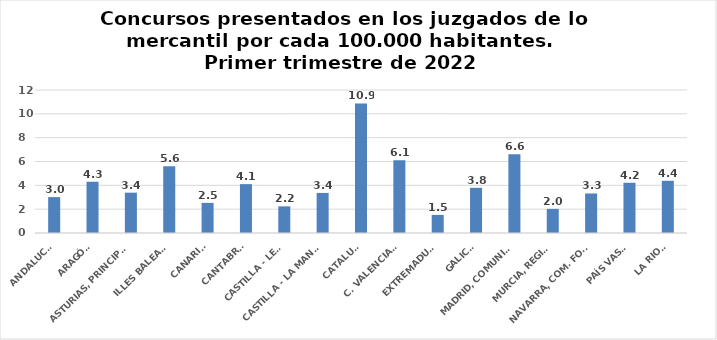
| Category | Series 0 |
|---|---|
| ANDALUCÍA | 3.013 |
| ARAGÓN | 4.301 |
| ASTURIAS, PRINCIPADO | 3.385 |
| ILLES BALEARS | 5.611 |
| CANARIAS | 2.527 |
| CANTABRIA | 4.101 |
| CASTILLA - LEÓN | 2.236 |
| CASTILLA - LA MANCHA | 3.362 |
| CATALUÑA | 10.869 |
| C. VALENCIANA | 6.109 |
| EXTREMADURA | 1.518 |
| GALICIA | 3.793 |
| MADRID, COMUNIDAD | 6.613 |
| MURCIA, REGIÓN | 2.024 |
| NAVARRA, COM. FORAL | 3.315 |
| PAÍS VASCO | 4.213 |
| LA RIOJA | 4.382 |